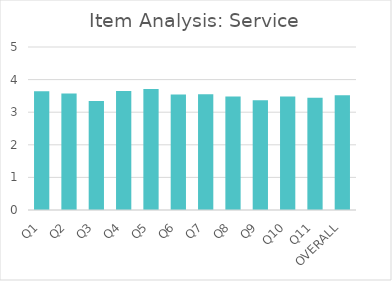
| Category | Series 0 |
|---|---|
| Q1 | 3.64 |
| Q2 | 3.57 |
| Q3 | 3.34 |
| Q4 | 3.65 |
| Q5 | 3.71 |
| Q6 | 3.54 |
| Q7 | 3.55 |
| Q8 | 3.48 |
| Q9 | 3.37 |
| Q10 | 3.48 |
| Q11 | 3.44 |
| OVERALL | 3.52 |